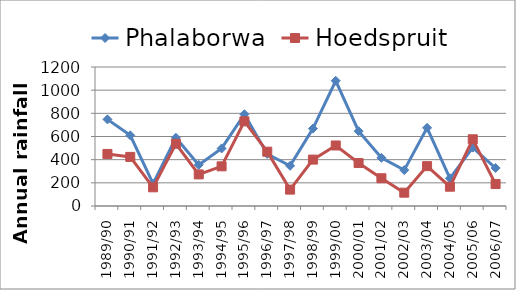
| Category | Phalaborwa | Hoedspruit |
|---|---|---|
| 1989/90 | 748 | 449.4 |
| 1990/91 | 610 | 423.9 |
| 1991/92 | 193 | 161.2 |
| 1992/93 | 589 | 537.4 |
| 1993/94 | 355 | 272.7 |
| 1994/95 | 497 | 342.3 |
| 1995/96 | 792 | 731 |
| 1996/97 | 449 | 468.8 |
| 1997/98 | 347 | 141.5 |
| 1998/99 | 668 | 400.5 |
| 1999/00 | 1081 | 522.5 |
| 2000/01 | 646 | 370.9 |
| 2001/02 | 416 | 239.5 |
| 2002/03 | 310 | 115 |
| 2003/04 | 675 | 344.1 |
| 2004/05 | 239 | 166.5 |
| 2005/06 | 504 | 576 |
| 2006/07 | 328 | 189.4 |